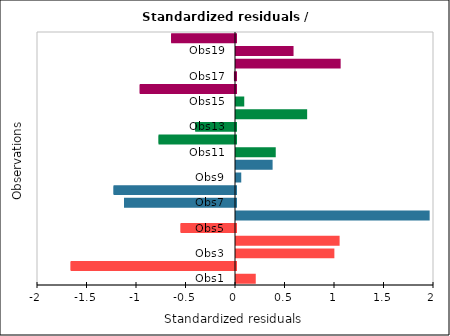
| Category | Series 0 |
|---|---|
| Obs1 | 0.19 |
| Obs2 | -1.66 |
| Obs3 | 0.984 |
| Obs4 | 1.036 |
| Obs5 | -0.55 |
| Obs6 | 1.946 |
| Obs7 | -1.121 |
| Obs8 | -1.227 |
| Obs9 | 0.042 |
| Obs10 | 0.36 |
| Obs11 | 0.391 |
| Obs12 | -0.772 |
| Obs13 | -0.402 |
| Obs14 | 0.709 |
| Obs15 | 0.074 |
| Obs16 | -0.962 |
| Obs17 | -0.011 |
| Obs18 | 1.047 |
| Obs19 | 0.571 |
| Obs20 | -0.645 |